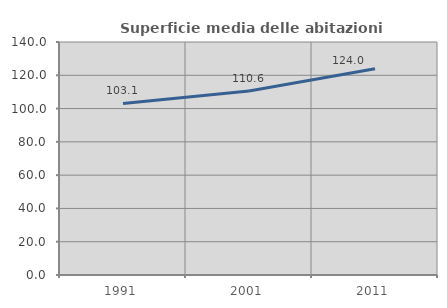
| Category | Superficie media delle abitazioni occupate |
|---|---|
| 1991.0 | 103.054 |
| 2001.0 | 110.576 |
| 2011.0 | 123.986 |